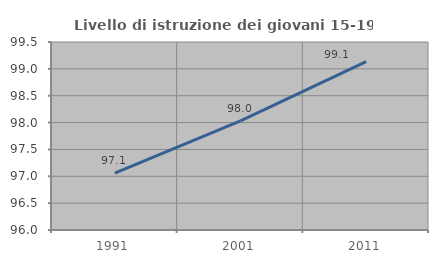
| Category | Livello di istruzione dei giovani 15-19 anni |
|---|---|
| 1991.0 | 97.059 |
| 2001.0 | 98.033 |
| 2011.0 | 99.135 |